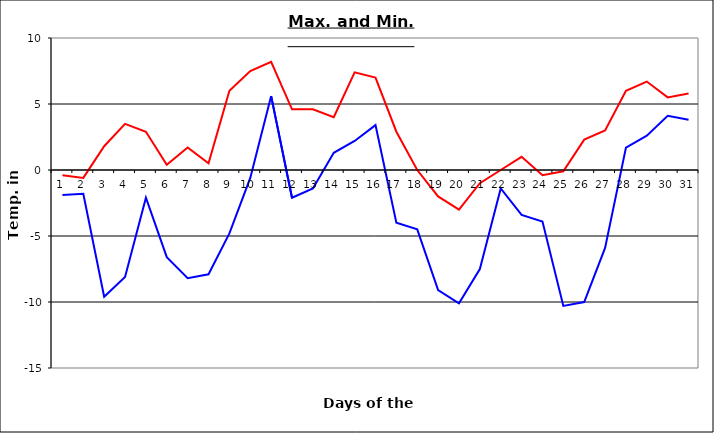
| Category | Series 0 | Series 1 |
|---|---|---|
| 0 | -0.4 | -1.9 |
| 1 | -0.6 | -1.8 |
| 2 | 1.8 | -9.6 |
| 3 | 3.5 | -8.1 |
| 4 | 2.9 | -2.1 |
| 5 | 0.4 | -6.6 |
| 6 | 1.7 | -8.2 |
| 7 | 0.5 | -7.9 |
| 8 | 6 | -4.8 |
| 9 | 7.5 | -0.6 |
| 10 | 8.2 | 5.6 |
| 11 | 4.6 | -2.1 |
| 12 | 4.6 | -1.4 |
| 13 | 4 | 1.3 |
| 14 | 7.4 | 2.2 |
| 15 | 7 | 3.4 |
| 16 | 2.9 | -4 |
| 17 | 0 | -4.5 |
| 18 | -2 | -9.1 |
| 19 | -3 | -10.1 |
| 20 | -1 | -7.5 |
| 21 | 0 | -1.4 |
| 22 | 1 | -3.4 |
| 23 | -0.4 | -3.9 |
| 24 | -0.1 | -10.3 |
| 25 | 2.3 | -10 |
| 26 | 3 | -5.9 |
| 27 | 6 | 1.7 |
| 28 | 6.7 | 2.6 |
| 29 | 5.5 | 4.1 |
| 30 | 5.8 | 3.8 |